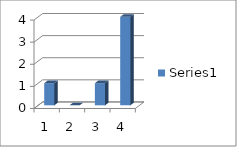
| Category | Series 0 |
|---|---|
| 0 | 1 |
| 1 | 0 |
| 2 | 1 |
| 3 | 4 |